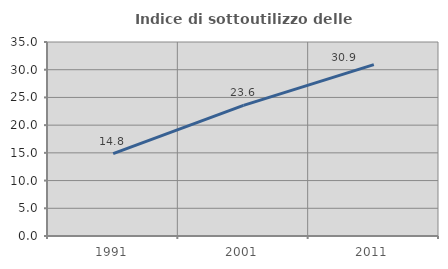
| Category | Indice di sottoutilizzo delle abitazioni  |
|---|---|
| 1991.0 | 14.847 |
| 2001.0 | 23.555 |
| 2011.0 | 30.91 |